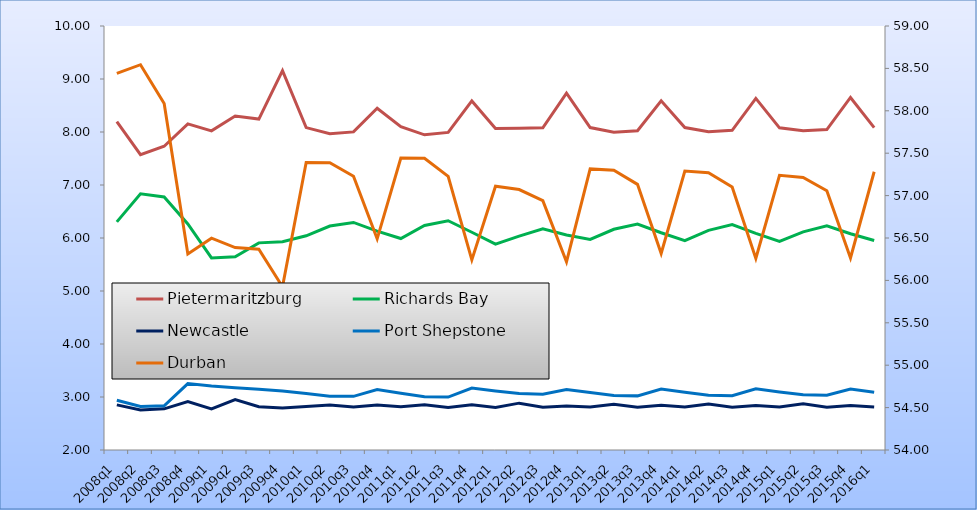
| Category | Pietermaritzburg | Richards Bay | Newcastle | Port Shepstone |
|---|---|---|---|---|
| 2008q1 | 8.195 | 6.304 | 2.851 | 2.938 |
| 2008q2 | 7.573 | 6.835 | 2.757 | 2.821 |
| 2008q3 | 7.73 | 6.774 | 2.777 | 2.835 |
| 2008q4 | 8.154 | 6.266 | 2.916 | 3.253 |
| 2009q1 | 8.022 | 5.624 | 2.776 | 3.207 |
| 2009q2 | 8.3 | 5.644 | 2.952 | 3.174 |
| 2009q3 | 8.244 | 5.908 | 2.816 | 3.148 |
| 2009q4 | 9.158 | 5.929 | 2.792 | 3.114 |
| 2010q1 | 8.083 | 6.042 | 2.821 | 3.066 |
| 2010q2 | 7.968 | 6.225 | 2.848 | 3.016 |
| 2010q3 | 8.002 | 6.293 | 2.809 | 3.012 |
| 2010q4 | 8.448 | 6.131 | 2.848 | 3.14 |
| 2011q1 | 8.1 | 5.99 | 2.816 | 3.07 |
| 2011q2 | 7.947 | 6.235 | 2.852 | 3.004 |
| 2011q3 | 7.992 | 6.325 | 2.801 | 2.998 |
| 2011q4 | 8.587 | 6.109 | 2.852 | 3.169 |
| 2012q1 | 8.068 | 5.885 | 2.804 | 3.114 |
| 2012q2 | 8.072 | 6.035 | 2.884 | 3.065 |
| 2012q3 | 8.079 | 6.175 | 2.809 | 3.053 |
| 2012q4 | 8.731 | 6.056 | 2.831 | 3.141 |
| 2013q1 | 8.084 | 5.972 | 2.814 | 3.084 |
| 2013q2 | 7.996 | 6.165 | 2.861 | 3.028 |
| 2013q3 | 8.024 | 6.265 | 2.806 | 3.021 |
| 2013q4 | 8.588 | 6.099 | 2.843 | 3.15 |
| 2014q1 | 8.084 | 5.949 | 2.811 | 3.089 |
| 2014q2 | 8.005 | 6.145 | 2.866 | 3.032 |
| 2014q3 | 8.032 | 6.255 | 2.805 | 3.024 |
| 2014q4 | 8.635 | 6.088 | 2.842 | 3.154 |
| 2015q1 | 8.079 | 5.936 | 2.81 | 3.096 |
| 2015q2 | 8.024 | 6.115 | 2.87 | 3.042 |
| 2015q3 | 8.045 | 6.232 | 2.807 | 3.033 |
| 2015q4 | 8.651 | 6.081 | 2.839 | 3.148 |
| 2016q1 | 8.082 | 5.952 | 2.812 | 3.09 |